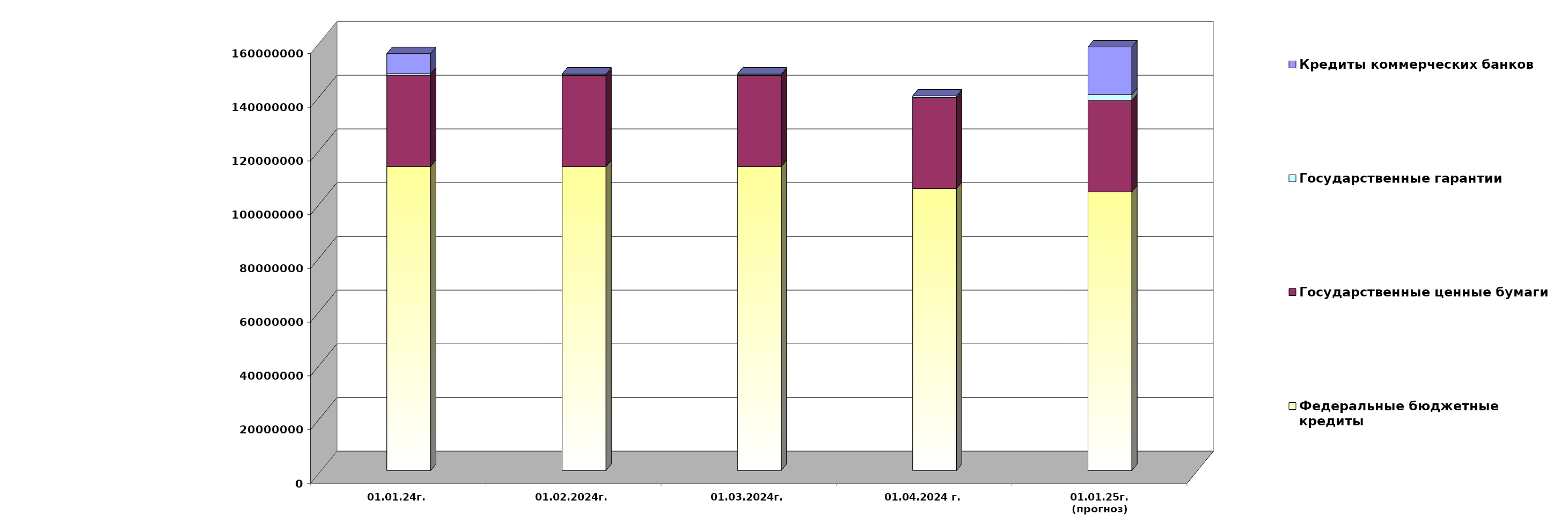
| Category | Федеральные бюджетные кредиты | Государственные ценные бумаги  | Государственные гарантии | Кредиты коммерческих банков |
|---|---|---|---|---|
| 01.01.24г. | 113223150.103 | 34000000 | 492844.914 | 7500000 |
| 01.02.2024г. | 113101358.397 | 34000000 | 490073.841 | 0 |
| 01.03.2024г. | 113101358.397 | 34000000 | 490331.207 | 0 |
| 01.04.2024 г. | 104987610.474 | 34000000 | 490571.969 | 0 |
| 01.01.25г.
(прогноз) | 103727859.3 | 34000000 | 2193508.4 | 17760298.9 |